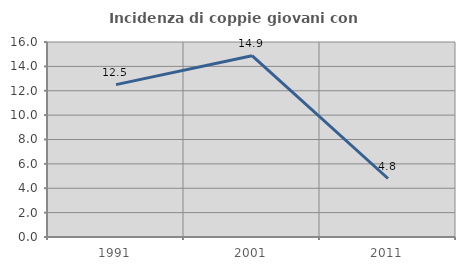
| Category | Incidenza di coppie giovani con figli |
|---|---|
| 1991.0 | 12.5 |
| 2001.0 | 14.876 |
| 2011.0 | 4.8 |